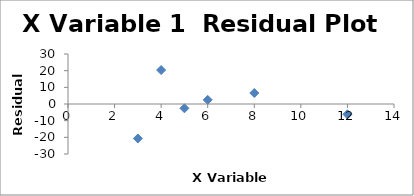
| Category | Series 0 |
|---|---|
| 6.0 | 2.481 |
| 4.0 | 20.369 |
| 3.0 | -20.688 |
| 5.0 | -2.575 |
| 8.0 | 6.594 |
| 12.0 | -6.181 |